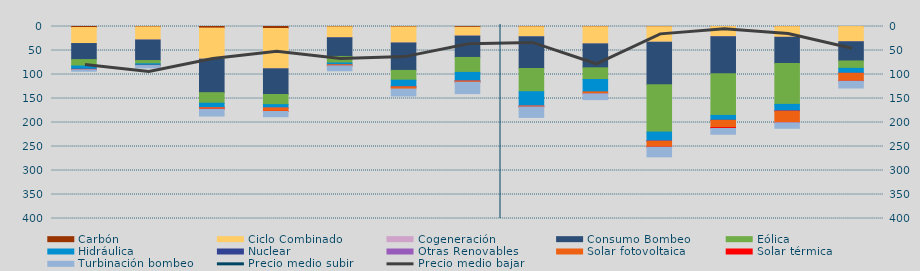
| Category | Carbón | Ciclo Combinado | Cogeneración | Consumo Bombeo | Eólica | Hidráulica | Nuclear | Otras Renovables | Solar fotovoltaica | Solar térmica | Turbinación bombeo |
|---|---|---|---|---|---|---|---|---|---|---|---|
| J | 2154.975 | 33372.05 | 35.5 | 33404.025 | 13344.6 | 6713.425 | 395.875 | 16.375 | 385.65 | 221.25 | 3231.725 |
| J | 780.225 | 27400.075 | 8 | 42750.35 | 6759.125 | 3263.775 | 115 | 0 | 90.1 | 206.65 | 4895.275 |
| A | 3351.92 | 64804.475 | 20.75 | 69703.55 | 22031.853 | 9149.525 | 70.975 | 22.5 | 2685.85 | 505.375 | 14186.525 |
| S | 4138.5 | 84055.788 | 26 | 53462.35 | 21071.172 | 6988.753 | 0 | 0.85 | 7069.199 | 219.625 | 10948.251 |
| O | 766.425 | 22723.1 | 23.25 | 38873.508 | 13638.3 | 3548.975 | 0 | 0 | 2254.075 | 15.75 | 10421.953 |
| N | 882.249 | 33437.299 | 73.35 | 57054.7 | 20324.708 | 13802.882 | 172 | 5.375 | 4519.267 | 0 | 14514.075 |
| D | 1625.533 | 18353.308 | 50.675 | 44452.158 | 31169.809 | 17718.259 | 225.525 | 7.75 | 2457.35 | 4.225 | 23848.4 |
| E | 624.15 | 20714.774 | 137.817 | 66005.482 | 48358.133 | 29783.675 | 0 | 1 | 1942.858 | 28.625 | 21792.308 |
| F | 573.3 | 35655.65 | 48.25 | 49817.85 | 24354.625 | 25831 | 0 | 0 | 3770.725 | 69.225 | 12196.8 |
| M | 501.25 | 32124.392 | 164.517 | 88685.498 | 98417.968 | 18612.512 | 448.75 | 16.575 | 11880.15 | 572.625 | 20112.843 |
| A | 170 | 20766.184 | 571.725 | 76937.455 | 86761.121 | 10133.333 | 40.925 | 0 | 14988.025 | 2004.65 | 12082.525 |
| M | 320.375 | 21993.7 | 252.925 | 54297.65 | 85403.658 | 12766.317 | 1357.65 | 14.475 | 23573.033 | 453.85 | 11577.425 |
| J | 92.075 | 31710.184 | 28.017 | 39954.501 | 15416.333 | 10344.86 | 11.25 | 38.75 | 16255.675 | 192.1 | 14074.425 |